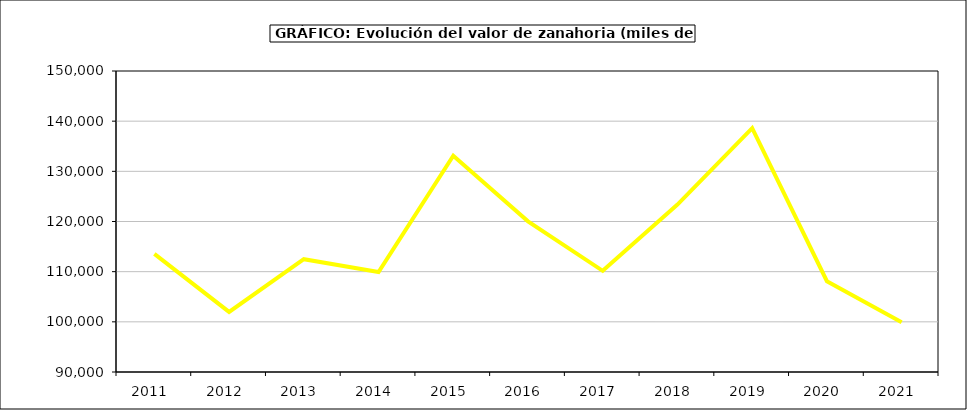
| Category | Valor |
|---|---|
| 2011.0 | 113537.975 |
| 2012.0 | 101980.864 |
| 2013.0 | 112485.085 |
| 2014.0 | 109919.203 |
| 2015.0 | 133120 |
| 2016.0 | 120031 |
| 2017.0 | 110169.914 |
| 2018.0 | 123370.95 |
| 2019.0 | 138615.206 |
| 2020.0 | 108091.405 |
| 2021.0 | 99893.158 |